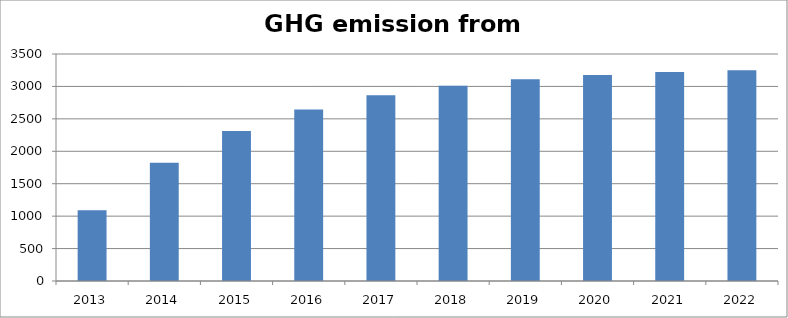
| Category | GHG emission from MSW |
|---|---|
| 2013.0 | 1091.663 |
| 2014.0 | 1823.426 |
| 2015.0 | 2313.942 |
| 2016.0 | 2642.744 |
| 2017.0 | 2863.147 |
| 2018.0 | 3010.887 |
| 2019.0 | 3109.921 |
| 2020.0 | 3176.305 |
| 2021.0 | 3220.804 |
| 2022.0 | 3250.632 |